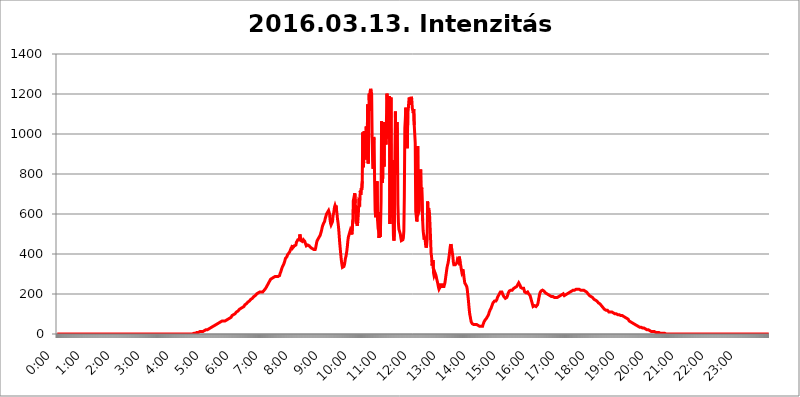
| Category | 2016.03.13. Intenzitás [W/m^2] |
|---|---|
| 0.0 | 0 |
| 0.0006944444444444445 | 0 |
| 0.001388888888888889 | 0 |
| 0.0020833333333333333 | 0 |
| 0.002777777777777778 | 0 |
| 0.003472222222222222 | 0 |
| 0.004166666666666667 | 0 |
| 0.004861111111111111 | 0 |
| 0.005555555555555556 | 0 |
| 0.0062499999999999995 | 0 |
| 0.006944444444444444 | 0 |
| 0.007638888888888889 | 0 |
| 0.008333333333333333 | 0 |
| 0.009027777777777779 | 0 |
| 0.009722222222222222 | 0 |
| 0.010416666666666666 | 0 |
| 0.011111111111111112 | 0 |
| 0.011805555555555555 | 0 |
| 0.012499999999999999 | 0 |
| 0.013194444444444444 | 0 |
| 0.013888888888888888 | 0 |
| 0.014583333333333332 | 0 |
| 0.015277777777777777 | 0 |
| 0.015972222222222224 | 0 |
| 0.016666666666666666 | 0 |
| 0.017361111111111112 | 0 |
| 0.018055555555555557 | 0 |
| 0.01875 | 0 |
| 0.019444444444444445 | 0 |
| 0.02013888888888889 | 0 |
| 0.020833333333333332 | 0 |
| 0.02152777777777778 | 0 |
| 0.022222222222222223 | 0 |
| 0.02291666666666667 | 0 |
| 0.02361111111111111 | 0 |
| 0.024305555555555556 | 0 |
| 0.024999999999999998 | 0 |
| 0.025694444444444447 | 0 |
| 0.02638888888888889 | 0 |
| 0.027083333333333334 | 0 |
| 0.027777777777777776 | 0 |
| 0.02847222222222222 | 0 |
| 0.029166666666666664 | 0 |
| 0.029861111111111113 | 0 |
| 0.030555555555555555 | 0 |
| 0.03125 | 0 |
| 0.03194444444444445 | 0 |
| 0.03263888888888889 | 0 |
| 0.03333333333333333 | 0 |
| 0.034027777777777775 | 0 |
| 0.034722222222222224 | 0 |
| 0.035416666666666666 | 0 |
| 0.036111111111111115 | 0 |
| 0.03680555555555556 | 0 |
| 0.0375 | 0 |
| 0.03819444444444444 | 0 |
| 0.03888888888888889 | 0 |
| 0.03958333333333333 | 0 |
| 0.04027777777777778 | 0 |
| 0.04097222222222222 | 0 |
| 0.041666666666666664 | 0 |
| 0.042361111111111106 | 0 |
| 0.04305555555555556 | 0 |
| 0.043750000000000004 | 0 |
| 0.044444444444444446 | 0 |
| 0.04513888888888889 | 0 |
| 0.04583333333333334 | 0 |
| 0.04652777777777778 | 0 |
| 0.04722222222222222 | 0 |
| 0.04791666666666666 | 0 |
| 0.04861111111111111 | 0 |
| 0.049305555555555554 | 0 |
| 0.049999999999999996 | 0 |
| 0.05069444444444445 | 0 |
| 0.051388888888888894 | 0 |
| 0.052083333333333336 | 0 |
| 0.05277777777777778 | 0 |
| 0.05347222222222222 | 0 |
| 0.05416666666666667 | 0 |
| 0.05486111111111111 | 0 |
| 0.05555555555555555 | 0 |
| 0.05625 | 0 |
| 0.05694444444444444 | 0 |
| 0.057638888888888885 | 0 |
| 0.05833333333333333 | 0 |
| 0.05902777777777778 | 0 |
| 0.059722222222222225 | 0 |
| 0.06041666666666667 | 0 |
| 0.061111111111111116 | 0 |
| 0.06180555555555556 | 0 |
| 0.0625 | 0 |
| 0.06319444444444444 | 0 |
| 0.06388888888888888 | 0 |
| 0.06458333333333334 | 0 |
| 0.06527777777777778 | 0 |
| 0.06597222222222222 | 0 |
| 0.06666666666666667 | 0 |
| 0.06736111111111111 | 0 |
| 0.06805555555555555 | 0 |
| 0.06874999999999999 | 0 |
| 0.06944444444444443 | 0 |
| 0.07013888888888889 | 0 |
| 0.07083333333333333 | 0 |
| 0.07152777777777779 | 0 |
| 0.07222222222222223 | 0 |
| 0.07291666666666667 | 0 |
| 0.07361111111111111 | 0 |
| 0.07430555555555556 | 0 |
| 0.075 | 0 |
| 0.07569444444444444 | 0 |
| 0.0763888888888889 | 0 |
| 0.07708333333333334 | 0 |
| 0.07777777777777778 | 0 |
| 0.07847222222222222 | 0 |
| 0.07916666666666666 | 0 |
| 0.0798611111111111 | 0 |
| 0.08055555555555556 | 0 |
| 0.08125 | 0 |
| 0.08194444444444444 | 0 |
| 0.08263888888888889 | 0 |
| 0.08333333333333333 | 0 |
| 0.08402777777777777 | 0 |
| 0.08472222222222221 | 0 |
| 0.08541666666666665 | 0 |
| 0.08611111111111112 | 0 |
| 0.08680555555555557 | 0 |
| 0.08750000000000001 | 0 |
| 0.08819444444444445 | 0 |
| 0.08888888888888889 | 0 |
| 0.08958333333333333 | 0 |
| 0.09027777777777778 | 0 |
| 0.09097222222222222 | 0 |
| 0.09166666666666667 | 0 |
| 0.09236111111111112 | 0 |
| 0.09305555555555556 | 0 |
| 0.09375 | 0 |
| 0.09444444444444444 | 0 |
| 0.09513888888888888 | 0 |
| 0.09583333333333333 | 0 |
| 0.09652777777777777 | 0 |
| 0.09722222222222222 | 0 |
| 0.09791666666666667 | 0 |
| 0.09861111111111111 | 0 |
| 0.09930555555555555 | 0 |
| 0.09999999999999999 | 0 |
| 0.10069444444444443 | 0 |
| 0.1013888888888889 | 0 |
| 0.10208333333333335 | 0 |
| 0.10277777777777779 | 0 |
| 0.10347222222222223 | 0 |
| 0.10416666666666667 | 0 |
| 0.10486111111111111 | 0 |
| 0.10555555555555556 | 0 |
| 0.10625 | 0 |
| 0.10694444444444444 | 0 |
| 0.1076388888888889 | 0 |
| 0.10833333333333334 | 0 |
| 0.10902777777777778 | 0 |
| 0.10972222222222222 | 0 |
| 0.1111111111111111 | 0 |
| 0.11180555555555556 | 0 |
| 0.11180555555555556 | 0 |
| 0.1125 | 0 |
| 0.11319444444444444 | 0 |
| 0.11388888888888889 | 0 |
| 0.11458333333333333 | 0 |
| 0.11527777777777777 | 0 |
| 0.11597222222222221 | 0 |
| 0.11666666666666665 | 0 |
| 0.1173611111111111 | 0 |
| 0.11805555555555557 | 0 |
| 0.11944444444444445 | 0 |
| 0.12013888888888889 | 0 |
| 0.12083333333333333 | 0 |
| 0.12152777777777778 | 0 |
| 0.12222222222222223 | 0 |
| 0.12291666666666667 | 0 |
| 0.12291666666666667 | 0 |
| 0.12361111111111112 | 0 |
| 0.12430555555555556 | 0 |
| 0.125 | 0 |
| 0.12569444444444444 | 0 |
| 0.12638888888888888 | 0 |
| 0.12708333333333333 | 0 |
| 0.16875 | 0 |
| 0.12847222222222224 | 0 |
| 0.12916666666666668 | 0 |
| 0.12986111111111112 | 0 |
| 0.13055555555555556 | 0 |
| 0.13125 | 0 |
| 0.13194444444444445 | 0 |
| 0.1326388888888889 | 0 |
| 0.13333333333333333 | 0 |
| 0.13402777777777777 | 0 |
| 0.13402777777777777 | 0 |
| 0.13472222222222222 | 0 |
| 0.13541666666666666 | 0 |
| 0.1361111111111111 | 0 |
| 0.13749999999999998 | 0 |
| 0.13819444444444443 | 0 |
| 0.1388888888888889 | 0 |
| 0.13958333333333334 | 0 |
| 0.14027777777777778 | 0 |
| 0.14097222222222222 | 0 |
| 0.14166666666666666 | 0 |
| 0.1423611111111111 | 0 |
| 0.14305555555555557 | 0 |
| 0.14375000000000002 | 0 |
| 0.14444444444444446 | 0 |
| 0.1451388888888889 | 0 |
| 0.1451388888888889 | 0 |
| 0.14652777777777778 | 0 |
| 0.14722222222222223 | 0 |
| 0.14791666666666667 | 0 |
| 0.1486111111111111 | 0 |
| 0.14930555555555555 | 0 |
| 0.15 | 0 |
| 0.15069444444444444 | 0 |
| 0.15138888888888888 | 0 |
| 0.15208333333333332 | 0 |
| 0.15277777777777776 | 0 |
| 0.15347222222222223 | 0 |
| 0.15416666666666667 | 0 |
| 0.15486111111111112 | 0 |
| 0.15555555555555556 | 0 |
| 0.15625 | 0 |
| 0.15694444444444444 | 0 |
| 0.15763888888888888 | 0 |
| 0.15833333333333333 | 0 |
| 0.15902777777777777 | 0 |
| 0.15972222222222224 | 0 |
| 0.16041666666666668 | 0 |
| 0.16111111111111112 | 0 |
| 0.16180555555555556 | 0 |
| 0.1625 | 0 |
| 0.16319444444444445 | 0 |
| 0.1638888888888889 | 0 |
| 0.16458333333333333 | 0 |
| 0.16527777777777777 | 0 |
| 0.16597222222222222 | 0 |
| 0.16666666666666666 | 0 |
| 0.1673611111111111 | 0 |
| 0.16805555555555554 | 0 |
| 0.16874999999999998 | 0 |
| 0.16944444444444443 | 0 |
| 0.17013888888888887 | 0 |
| 0.1708333333333333 | 0 |
| 0.17152777777777775 | 0 |
| 0.17222222222222225 | 0 |
| 0.1729166666666667 | 0 |
| 0.17361111111111113 | 0 |
| 0.17430555555555557 | 0 |
| 0.17500000000000002 | 0 |
| 0.17569444444444446 | 0 |
| 0.1763888888888889 | 0 |
| 0.17708333333333334 | 0 |
| 0.17777777777777778 | 0 |
| 0.17847222222222223 | 0 |
| 0.17916666666666667 | 0 |
| 0.1798611111111111 | 0 |
| 0.18055555555555555 | 0 |
| 0.18125 | 0 |
| 0.18194444444444444 | 0 |
| 0.1826388888888889 | 0 |
| 0.18333333333333335 | 0 |
| 0.1840277777777778 | 0 |
| 0.18472222222222223 | 0 |
| 0.18541666666666667 | 0 |
| 0.18611111111111112 | 0 |
| 0.18680555555555556 | 0 |
| 0.1875 | 0 |
| 0.18819444444444444 | 0 |
| 0.18888888888888888 | 0 |
| 0.18958333333333333 | 0 |
| 0.19027777777777777 | 3.525 |
| 0.1909722222222222 | 3.525 |
| 0.19166666666666665 | 3.525 |
| 0.19236111111111112 | 3.525 |
| 0.19305555555555554 | 3.525 |
| 0.19375 | 3.525 |
| 0.19444444444444445 | 3.525 |
| 0.1951388888888889 | 3.525 |
| 0.19583333333333333 | 7.887 |
| 0.19652777777777777 | 7.887 |
| 0.19722222222222222 | 7.887 |
| 0.19791666666666666 | 7.887 |
| 0.1986111111111111 | 7.887 |
| 0.19930555555555554 | 12.257 |
| 0.19999999999999998 | 12.257 |
| 0.20069444444444443 | 12.257 |
| 0.20138888888888887 | 12.257 |
| 0.2020833333333333 | 12.257 |
| 0.2027777777777778 | 12.257 |
| 0.2034722222222222 | 12.257 |
| 0.2041666666666667 | 12.257 |
| 0.20486111111111113 | 16.636 |
| 0.20555555555555557 | 16.636 |
| 0.20625000000000002 | 16.636 |
| 0.20694444444444446 | 16.636 |
| 0.2076388888888889 | 16.636 |
| 0.20833333333333334 | 21.024 |
| 0.20902777777777778 | 21.024 |
| 0.20972222222222223 | 21.024 |
| 0.21041666666666667 | 21.024 |
| 0.2111111111111111 | 25.419 |
| 0.21180555555555555 | 25.419 |
| 0.2125 | 25.419 |
| 0.21319444444444444 | 29.823 |
| 0.2138888888888889 | 29.823 |
| 0.21458333333333335 | 29.823 |
| 0.2152777777777778 | 34.234 |
| 0.21597222222222223 | 34.234 |
| 0.21666666666666667 | 34.234 |
| 0.21736111111111112 | 38.653 |
| 0.21805555555555556 | 38.653 |
| 0.21875 | 38.653 |
| 0.21944444444444444 | 43.079 |
| 0.22013888888888888 | 43.079 |
| 0.22083333333333333 | 43.079 |
| 0.22152777777777777 | 47.511 |
| 0.2222222222222222 | 47.511 |
| 0.22291666666666665 | 47.511 |
| 0.2236111111111111 | 51.951 |
| 0.22430555555555556 | 51.951 |
| 0.225 | 51.951 |
| 0.22569444444444445 | 56.398 |
| 0.2263888888888889 | 56.398 |
| 0.22708333333333333 | 56.398 |
| 0.22777777777777777 | 60.85 |
| 0.22847222222222222 | 60.85 |
| 0.22916666666666666 | 60.85 |
| 0.2298611111111111 | 60.85 |
| 0.23055555555555554 | 65.31 |
| 0.23124999999999998 | 65.31 |
| 0.23194444444444443 | 65.31 |
| 0.23263888888888887 | 65.31 |
| 0.2333333333333333 | 65.31 |
| 0.2340277777777778 | 65.31 |
| 0.2347222222222222 | 65.31 |
| 0.2354166666666667 | 65.31 |
| 0.23611111111111113 | 65.31 |
| 0.23680555555555557 | 69.775 |
| 0.23750000000000002 | 69.775 |
| 0.23819444444444446 | 69.775 |
| 0.2388888888888889 | 69.775 |
| 0.23958333333333334 | 74.246 |
| 0.24027777777777778 | 74.246 |
| 0.24097222222222223 | 74.246 |
| 0.24166666666666667 | 78.722 |
| 0.2423611111111111 | 83.205 |
| 0.24305555555555555 | 83.205 |
| 0.24375 | 83.205 |
| 0.24444444444444446 | 87.692 |
| 0.24513888888888888 | 92.184 |
| 0.24583333333333335 | 92.184 |
| 0.2465277777777778 | 92.184 |
| 0.24722222222222223 | 96.682 |
| 0.24791666666666667 | 96.682 |
| 0.24861111111111112 | 101.184 |
| 0.24930555555555556 | 101.184 |
| 0.25 | 101.184 |
| 0.25069444444444444 | 105.69 |
| 0.2513888888888889 | 110.201 |
| 0.2520833333333333 | 110.201 |
| 0.25277777777777777 | 110.201 |
| 0.2534722222222222 | 114.716 |
| 0.25416666666666665 | 119.235 |
| 0.2548611111111111 | 119.235 |
| 0.2555555555555556 | 123.758 |
| 0.25625000000000003 | 123.758 |
| 0.2569444444444445 | 123.758 |
| 0.2576388888888889 | 128.284 |
| 0.25833333333333336 | 128.284 |
| 0.2590277777777778 | 128.284 |
| 0.25972222222222224 | 132.814 |
| 0.2604166666666667 | 137.347 |
| 0.2611111111111111 | 137.347 |
| 0.26180555555555557 | 137.347 |
| 0.2625 | 141.884 |
| 0.26319444444444445 | 146.423 |
| 0.2638888888888889 | 146.423 |
| 0.26458333333333334 | 150.964 |
| 0.2652777777777778 | 150.964 |
| 0.2659722222222222 | 155.509 |
| 0.26666666666666666 | 155.509 |
| 0.2673611111111111 | 160.056 |
| 0.26805555555555555 | 160.056 |
| 0.26875 | 164.605 |
| 0.26944444444444443 | 164.605 |
| 0.2701388888888889 | 169.156 |
| 0.2708333333333333 | 169.156 |
| 0.27152777777777776 | 173.709 |
| 0.2722222222222222 | 173.709 |
| 0.27291666666666664 | 178.264 |
| 0.2736111111111111 | 178.264 |
| 0.2743055555555555 | 182.82 |
| 0.27499999999999997 | 182.82 |
| 0.27569444444444446 | 187.378 |
| 0.27638888888888885 | 187.378 |
| 0.27708333333333335 | 191.937 |
| 0.2777777777777778 | 191.937 |
| 0.27847222222222223 | 196.497 |
| 0.2791666666666667 | 196.497 |
| 0.2798611111111111 | 201.058 |
| 0.28055555555555556 | 201.058 |
| 0.28125 | 201.058 |
| 0.28194444444444444 | 205.62 |
| 0.2826388888888889 | 205.62 |
| 0.2833333333333333 | 210.182 |
| 0.28402777777777777 | 210.182 |
| 0.2847222222222222 | 210.182 |
| 0.28541666666666665 | 210.182 |
| 0.28611111111111115 | 210.182 |
| 0.28680555555555554 | 210.182 |
| 0.28750000000000003 | 210.182 |
| 0.2881944444444445 | 210.182 |
| 0.2888888888888889 | 210.182 |
| 0.28958333333333336 | 214.746 |
| 0.2902777777777778 | 219.309 |
| 0.29097222222222224 | 219.309 |
| 0.2916666666666667 | 223.873 |
| 0.2923611111111111 | 228.436 |
| 0.29305555555555557 | 233 |
| 0.29375 | 237.564 |
| 0.29444444444444445 | 242.127 |
| 0.2951388888888889 | 246.689 |
| 0.29583333333333334 | 251.251 |
| 0.2965277777777778 | 255.813 |
| 0.2972222222222222 | 260.373 |
| 0.29791666666666666 | 264.932 |
| 0.2986111111111111 | 269.49 |
| 0.29930555555555555 | 274.047 |
| 0.3 | 274.047 |
| 0.30069444444444443 | 278.603 |
| 0.3013888888888889 | 278.603 |
| 0.3020833333333333 | 278.603 |
| 0.30277777777777776 | 283.156 |
| 0.3034722222222222 | 283.156 |
| 0.30416666666666664 | 287.709 |
| 0.3048611111111111 | 287.709 |
| 0.3055555555555555 | 287.709 |
| 0.30624999999999997 | 287.709 |
| 0.3069444444444444 | 287.709 |
| 0.3076388888888889 | 287.709 |
| 0.30833333333333335 | 287.709 |
| 0.3090277777777778 | 287.709 |
| 0.30972222222222223 | 287.709 |
| 0.3104166666666667 | 287.709 |
| 0.3111111111111111 | 292.259 |
| 0.31180555555555556 | 292.259 |
| 0.3125 | 301.354 |
| 0.31319444444444444 | 305.898 |
| 0.3138888888888889 | 314.98 |
| 0.3145833333333333 | 324.052 |
| 0.31527777777777777 | 328.584 |
| 0.3159722222222222 | 337.639 |
| 0.31666666666666665 | 342.162 |
| 0.31736111111111115 | 346.682 |
| 0.31805555555555554 | 351.198 |
| 0.31875000000000003 | 360.221 |
| 0.3194444444444445 | 369.23 |
| 0.3201388888888889 | 378.224 |
| 0.32083333333333336 | 378.224 |
| 0.3215277777777778 | 382.715 |
| 0.32222222222222224 | 387.202 |
| 0.3229166666666667 | 396.164 |
| 0.3236111111111111 | 400.638 |
| 0.32430555555555557 | 400.638 |
| 0.325 | 405.108 |
| 0.32569444444444445 | 409.574 |
| 0.3263888888888889 | 414.035 |
| 0.32708333333333334 | 414.035 |
| 0.3277777777777778 | 427.39 |
| 0.3284722222222222 | 422.943 |
| 0.32916666666666666 | 436.27 |
| 0.3298611111111111 | 445.129 |
| 0.33055555555555555 | 431.833 |
| 0.33125 | 431.833 |
| 0.33194444444444443 | 431.833 |
| 0.3326388888888889 | 440.702 |
| 0.3333333333333333 | 445.129 |
| 0.3340277777777778 | 440.702 |
| 0.3347222222222222 | 445.129 |
| 0.3354166666666667 | 458.38 |
| 0.3361111111111111 | 458.38 |
| 0.3368055555555556 | 462.786 |
| 0.33749999999999997 | 471.582 |
| 0.33819444444444446 | 467.187 |
| 0.33888888888888885 | 471.582 |
| 0.33958333333333335 | 471.582 |
| 0.34027777777777773 | 497.836 |
| 0.34097222222222223 | 484.735 |
| 0.3416666666666666 | 467.187 |
| 0.3423611111111111 | 462.786 |
| 0.3430555555555555 | 462.786 |
| 0.34375 | 462.786 |
| 0.3444444444444445 | 462.786 |
| 0.3451388888888889 | 471.582 |
| 0.3458333333333334 | 467.187 |
| 0.34652777777777777 | 467.187 |
| 0.34722222222222227 | 462.786 |
| 0.34791666666666665 | 453.968 |
| 0.34861111111111115 | 449.551 |
| 0.34930555555555554 | 440.702 |
| 0.35000000000000003 | 440.702 |
| 0.3506944444444444 | 445.129 |
| 0.3513888888888889 | 445.129 |
| 0.3520833333333333 | 449.551 |
| 0.3527777777777778 | 440.702 |
| 0.3534722222222222 | 440.702 |
| 0.3541666666666667 | 436.27 |
| 0.3548611111111111 | 436.27 |
| 0.35555555555555557 | 431.833 |
| 0.35625 | 431.833 |
| 0.35694444444444445 | 427.39 |
| 0.3576388888888889 | 427.39 |
| 0.35833333333333334 | 422.943 |
| 0.3590277777777778 | 422.943 |
| 0.3597222222222222 | 422.943 |
| 0.36041666666666666 | 418.492 |
| 0.3611111111111111 | 418.492 |
| 0.36180555555555555 | 422.943 |
| 0.3625 | 431.833 |
| 0.36319444444444443 | 445.129 |
| 0.3638888888888889 | 458.38 |
| 0.3645833333333333 | 467.187 |
| 0.3652777777777778 | 471.582 |
| 0.3659722222222222 | 475.972 |
| 0.3666666666666667 | 480.356 |
| 0.3673611111111111 | 484.735 |
| 0.3680555555555556 | 489.108 |
| 0.36874999999999997 | 493.475 |
| 0.36944444444444446 | 502.192 |
| 0.37013888888888885 | 506.542 |
| 0.37083333333333335 | 519.555 |
| 0.37152777777777773 | 532.513 |
| 0.37222222222222223 | 541.121 |
| 0.3729166666666666 | 545.416 |
| 0.3736111111111111 | 553.986 |
| 0.3743055555555555 | 558.261 |
| 0.375 | 562.53 |
| 0.3756944444444445 | 575.299 |
| 0.3763888888888889 | 575.299 |
| 0.3770833333333334 | 592.233 |
| 0.37777777777777777 | 600.661 |
| 0.37847222222222227 | 604.864 |
| 0.37916666666666665 | 609.062 |
| 0.37986111111111115 | 613.252 |
| 0.38055555555555554 | 617.436 |
| 0.38125000000000003 | 621.613 |
| 0.3819444444444444 | 600.661 |
| 0.3826388888888889 | 571.049 |
| 0.3833333333333333 | 553.986 |
| 0.3840277777777778 | 545.416 |
| 0.3847222222222222 | 541.121 |
| 0.3854166666666667 | 549.704 |
| 0.3861111111111111 | 562.53 |
| 0.38680555555555557 | 592.233 |
| 0.3875 | 600.661 |
| 0.38819444444444445 | 617.436 |
| 0.3888888888888889 | 634.105 |
| 0.38958333333333334 | 642.4 |
| 0.3902777777777778 | 634.105 |
| 0.3909722222222222 | 642.4 |
| 0.39166666666666666 | 621.613 |
| 0.3923611111111111 | 600.661 |
| 0.39305555555555555 | 575.299 |
| 0.39375 | 558.261 |
| 0.39444444444444443 | 536.82 |
| 0.3951388888888889 | 506.542 |
| 0.3958333333333333 | 471.582 |
| 0.3965277777777778 | 440.702 |
| 0.3972222222222222 | 414.035 |
| 0.3979166666666667 | 387.202 |
| 0.3986111111111111 | 364.728 |
| 0.3993055555555556 | 346.682 |
| 0.39999999999999997 | 333.113 |
| 0.40069444444444446 | 328.584 |
| 0.40138888888888885 | 333.113 |
| 0.40208333333333335 | 337.639 |
| 0.40277777777777773 | 346.682 |
| 0.40347222222222223 | 360.221 |
| 0.4041666666666666 | 378.224 |
| 0.4048611111111111 | 387.202 |
| 0.4055555555555555 | 400.638 |
| 0.40625 | 418.492 |
| 0.4069444444444445 | 440.702 |
| 0.4076388888888889 | 467.187 |
| 0.4083333333333334 | 484.735 |
| 0.40902777777777777 | 493.475 |
| 0.40972222222222227 | 497.836 |
| 0.41041666666666665 | 510.885 |
| 0.41111111111111115 | 519.555 |
| 0.41180555555555554 | 519.555 |
| 0.41250000000000003 | 506.542 |
| 0.4131944444444444 | 497.836 |
| 0.4138888888888889 | 502.192 |
| 0.4145833333333333 | 566.793 |
| 0.4152777777777778 | 667.123 |
| 0.4159722222222222 | 671.22 |
| 0.4166666666666667 | 667.123 |
| 0.4173611111111111 | 703.762 |
| 0.41805555555555557 | 654.791 |
| 0.41875 | 566.793 |
| 0.41944444444444445 | 562.53 |
| 0.4201388888888889 | 549.704 |
| 0.42083333333333334 | 541.121 |
| 0.4215277777777778 | 562.53 |
| 0.4222222222222222 | 596.45 |
| 0.42291666666666666 | 663.019 |
| 0.4236111111111111 | 658.909 |
| 0.42430555555555555 | 654.791 |
| 0.425 | 715.858 |
| 0.42569444444444443 | 695.666 |
| 0.4263888888888889 | 727.896 |
| 0.4270833333333333 | 719.877 |
| 0.4277777777777778 | 763.674 |
| 0.4284722222222222 | 1007.383 |
| 0.4291666666666667 | 833.834 |
| 0.4298611111111111 | 860.676 |
| 0.4305555555555556 | 1014.852 |
| 0.43124999999999997 | 891.099 |
| 0.43194444444444446 | 872.114 |
| 0.43263888888888885 | 906.223 |
| 0.43333333333333335 | 1037.277 |
| 0.43402777777777773 | 973.772 |
| 0.43472222222222223 | 955.071 |
| 0.4354166666666666 | 1147.086 |
| 0.4361111111111111 | 853.029 |
| 0.4368055555555555 | 999.916 |
| 0.4375 | 1201.843 |
| 0.4381944444444445 | 1116.426 |
| 0.4388888888888889 | 1213.804 |
| 0.4395833333333334 | 1225.859 |
| 0.44027777777777777 | 1213.804 |
| 0.44097222222222227 | 1201.843 |
| 0.44166666666666665 | 973.772 |
| 0.44236111111111115 | 868.305 |
| 0.44305555555555554 | 826.123 |
| 0.44375000000000003 | 984.98 |
| 0.4444444444444444 | 970.034 |
| 0.4451388888888889 | 759.723 |
| 0.4458333333333333 | 617.436 |
| 0.4465277777777778 | 583.779 |
| 0.4472222222222222 | 583.779 |
| 0.4479166666666667 | 743.859 |
| 0.4486111111111111 | 763.674 |
| 0.44930555555555557 | 566.793 |
| 0.45 | 528.2 |
| 0.45069444444444445 | 515.223 |
| 0.4513888888888889 | 480.356 |
| 0.45208333333333334 | 609.062 |
| 0.4527777777777778 | 484.735 |
| 0.4534722222222222 | 545.416 |
| 0.45416666666666666 | 663.019 |
| 0.4548611111111111 | 1063.51 |
| 0.45555555555555555 | 883.516 |
| 0.45625 | 755.766 |
| 0.45694444444444443 | 891.099 |
| 0.4576388888888889 | 943.832 |
| 0.4583333333333333 | 837.682 |
| 0.4590277777777778 | 1059.756 |
| 0.4597222222222222 | 1033.537 |
| 0.4604166666666667 | 1011.118 |
| 0.4611111111111111 | 947.58 |
| 0.4618055555555556 | 1086.097 |
| 0.46249999999999997 | 1201.843 |
| 0.46319444444444446 | 1078.555 |
| 0.46388888888888885 | 977.508 |
| 0.46458333333333335 | 1143.232 |
| 0.46527777777777773 | 1105.019 |
| 0.46597222222222223 | 1189.969 |
| 0.4666666666666666 | 549.704 |
| 0.4673611111111111 | 860.676 |
| 0.4680555555555555 | 1182.099 |
| 0.46875 | 583.779 |
| 0.4694444444444445 | 763.674 |
| 0.4701388888888889 | 868.305 |
| 0.4708333333333334 | 613.252 |
| 0.47152777777777777 | 489.108 |
| 0.47222222222222227 | 467.187 |
| 0.47291666666666665 | 519.555 |
| 0.47361111111111115 | 902.447 |
| 0.47430555555555554 | 1112.618 |
| 0.47500000000000003 | 795.074 |
| 0.4756944444444444 | 795.074 |
| 0.4763888888888889 | 1059.756 |
| 0.4770833333333333 | 992.448 |
| 0.4777777777777778 | 646.537 |
| 0.4784722222222222 | 558.261 |
| 0.4791666666666667 | 523.88 |
| 0.4798611111111111 | 515.223 |
| 0.48055555555555557 | 510.885 |
| 0.48125 | 497.836 |
| 0.48194444444444445 | 480.356 |
| 0.4826388888888889 | 467.187 |
| 0.48333333333333334 | 462.786 |
| 0.4840277777777778 | 471.582 |
| 0.4847222222222222 | 471.582 |
| 0.48541666666666666 | 480.356 |
| 0.4861111111111111 | 515.223 |
| 0.48680555555555555 | 687.544 |
| 0.4875 | 1029.798 |
| 0.48819444444444443 | 1074.789 |
| 0.4888888888888889 | 1131.708 |
| 0.4895833333333333 | 1037.277 |
| 0.4902777777777778 | 973.772 |
| 0.4909722222222222 | 928.819 |
| 0.4916666666666667 | 1108.816 |
| 0.4923611111111111 | 1124.056 |
| 0.4930555555555556 | 1162.571 |
| 0.49374999999999997 | 1182.099 |
| 0.49444444444444446 | 1147.086 |
| 0.49513888888888885 | 1154.814 |
| 0.49583333333333335 | 1178.177 |
| 0.49652777777777773 | 1186.03 |
| 0.49722222222222223 | 1174.263 |
| 0.4979166666666666 | 1131.708 |
| 0.4986111111111111 | 1127.879 |
| 0.4993055555555555 | 1105.019 |
| 0.5 | 1124.056 |
| 0.5006944444444444 | 1044.762 |
| 0.5013888888888889 | 1041.019 |
| 0.5020833333333333 | 955.071 |
| 0.5027777777777778 | 613.252 |
| 0.5034722222222222 | 592.233 |
| 0.5041666666666667 | 562.53 |
| 0.5048611111111111 | 571.049 |
| 0.5055555555555555 | 940.082 |
| 0.50625 | 617.436 |
| 0.5069444444444444 | 609.062 |
| 0.5076388888888889 | 617.436 |
| 0.5083333333333333 | 731.896 |
| 0.5090277777777777 | 767.62 |
| 0.5097222222222222 | 822.26 |
| 0.5104166666666666 | 667.123 |
| 0.5111111111111112 | 731.896 |
| 0.5118055555555555 | 727.896 |
| 0.5125000000000001 | 566.793 |
| 0.5131944444444444 | 515.223 |
| 0.513888888888889 | 493.475 |
| 0.5145833333333333 | 471.582 |
| 0.5152777777777778 | 480.356 |
| 0.5159722222222222 | 471.582 |
| 0.5166666666666667 | 445.129 |
| 0.517361111111111 | 431.833 |
| 0.5180555555555556 | 440.702 |
| 0.5187499999999999 | 471.582 |
| 0.5194444444444445 | 663.019 |
| 0.5201388888888888 | 562.53 |
| 0.5208333333333334 | 629.948 |
| 0.5215277777777778 | 625.784 |
| 0.5222222222222223 | 592.233 |
| 0.5229166666666667 | 536.82 |
| 0.5236111111111111 | 475.972 |
| 0.5243055555555556 | 405.108 |
| 0.525 | 387.202 |
| 0.5256944444444445 | 342.162 |
| 0.5263888888888889 | 342.162 |
| 0.5270833333333333 | 369.23 |
| 0.5277777777777778 | 305.898 |
| 0.5284722222222222 | 292.259 |
| 0.5291666666666667 | 296.808 |
| 0.5298611111111111 | 305.898 |
| 0.5305555555555556 | 305.898 |
| 0.53125 | 292.259 |
| 0.5319444444444444 | 278.603 |
| 0.5326388888888889 | 269.49 |
| 0.5333333333333333 | 269.49 |
| 0.5340277777777778 | 246.689 |
| 0.5347222222222222 | 233 |
| 0.5354166666666667 | 223.873 |
| 0.5361111111111111 | 223.873 |
| 0.5368055555555555 | 233 |
| 0.5375 | 246.689 |
| 0.5381944444444444 | 251.251 |
| 0.5388888888888889 | 251.251 |
| 0.5395833333333333 | 246.689 |
| 0.5402777777777777 | 237.564 |
| 0.5409722222222222 | 233 |
| 0.5416666666666666 | 233 |
| 0.5423611111111112 | 237.564 |
| 0.5430555555555555 | 246.689 |
| 0.5437500000000001 | 255.813 |
| 0.5444444444444444 | 274.047 |
| 0.545138888888889 | 292.259 |
| 0.5458333333333333 | 310.44 |
| 0.5465277777777778 | 328.584 |
| 0.5472222222222222 | 342.162 |
| 0.5479166666666667 | 351.198 |
| 0.548611111111111 | 364.728 |
| 0.5493055555555556 | 382.715 |
| 0.5499999999999999 | 400.638 |
| 0.5506944444444445 | 422.943 |
| 0.5513888888888888 | 440.702 |
| 0.5520833333333334 | 449.551 |
| 0.5527777777777778 | 436.27 |
| 0.5534722222222223 | 422.943 |
| 0.5541666666666667 | 405.108 |
| 0.5548611111111111 | 387.202 |
| 0.5555555555555556 | 360.221 |
| 0.55625 | 346.682 |
| 0.5569444444444445 | 342.162 |
| 0.5576388888888889 | 342.162 |
| 0.5583333333333333 | 346.682 |
| 0.5590277777777778 | 351.198 |
| 0.5597222222222222 | 351.198 |
| 0.5604166666666667 | 355.712 |
| 0.5611111111111111 | 369.23 |
| 0.5618055555555556 | 364.728 |
| 0.5625 | 360.221 |
| 0.5631944444444444 | 360.221 |
| 0.5638888888888889 | 387.202 |
| 0.5645833333333333 | 382.715 |
| 0.5652777777777778 | 351.198 |
| 0.5659722222222222 | 342.162 |
| 0.5666666666666667 | 324.052 |
| 0.5673611111111111 | 310.44 |
| 0.5680555555555555 | 310.44 |
| 0.56875 | 324.052 |
| 0.5694444444444444 | 324.052 |
| 0.5701388888888889 | 292.259 |
| 0.5708333333333333 | 274.047 |
| 0.5715277777777777 | 255.813 |
| 0.5722222222222222 | 251.251 |
| 0.5729166666666666 | 246.689 |
| 0.5736111111111112 | 246.689 |
| 0.5743055555555555 | 237.564 |
| 0.5750000000000001 | 223.873 |
| 0.5756944444444444 | 201.058 |
| 0.576388888888889 | 178.264 |
| 0.5770833333333333 | 150.964 |
| 0.5777777777777778 | 123.758 |
| 0.5784722222222222 | 101.184 |
| 0.5791666666666667 | 87.692 |
| 0.579861111111111 | 74.246 |
| 0.5805555555555556 | 60.85 |
| 0.5812499999999999 | 56.398 |
| 0.5819444444444445 | 51.951 |
| 0.5826388888888888 | 47.511 |
| 0.5833333333333334 | 47.511 |
| 0.5840277777777778 | 47.511 |
| 0.5847222222222223 | 47.511 |
| 0.5854166666666667 | 47.511 |
| 0.5861111111111111 | 47.511 |
| 0.5868055555555556 | 47.511 |
| 0.5875 | 47.511 |
| 0.5881944444444445 | 47.511 |
| 0.5888888888888889 | 47.511 |
| 0.5895833333333333 | 47.511 |
| 0.5902777777777778 | 43.079 |
| 0.5909722222222222 | 43.079 |
| 0.5916666666666667 | 38.653 |
| 0.5923611111111111 | 38.653 |
| 0.5930555555555556 | 38.653 |
| 0.59375 | 38.653 |
| 0.5944444444444444 | 38.653 |
| 0.5951388888888889 | 34.234 |
| 0.5958333333333333 | 34.234 |
| 0.5965277777777778 | 38.653 |
| 0.5972222222222222 | 47.511 |
| 0.5979166666666667 | 51.951 |
| 0.5986111111111111 | 60.85 |
| 0.5993055555555555 | 65.31 |
| 0.6 | 69.775 |
| 0.6006944444444444 | 69.775 |
| 0.6013888888888889 | 74.246 |
| 0.6020833333333333 | 78.722 |
| 0.6027777777777777 | 83.205 |
| 0.6034722222222222 | 87.692 |
| 0.6041666666666666 | 92.184 |
| 0.6048611111111112 | 96.682 |
| 0.6055555555555555 | 105.69 |
| 0.6062500000000001 | 110.201 |
| 0.6069444444444444 | 119.235 |
| 0.607638888888889 | 123.758 |
| 0.6083333333333333 | 128.284 |
| 0.6090277777777778 | 132.814 |
| 0.6097222222222222 | 141.884 |
| 0.6104166666666667 | 146.423 |
| 0.611111111111111 | 155.509 |
| 0.6118055555555556 | 155.509 |
| 0.6124999999999999 | 160.056 |
| 0.6131944444444445 | 164.605 |
| 0.6138888888888888 | 164.605 |
| 0.6145833333333334 | 164.605 |
| 0.6152777777777778 | 164.605 |
| 0.6159722222222223 | 169.156 |
| 0.6166666666666667 | 173.709 |
| 0.6173611111111111 | 182.82 |
| 0.6180555555555556 | 187.378 |
| 0.61875 | 191.937 |
| 0.6194444444444445 | 196.497 |
| 0.6201388888888889 | 201.058 |
| 0.6208333333333333 | 205.62 |
| 0.6215277777777778 | 210.182 |
| 0.6222222222222222 | 210.182 |
| 0.6229166666666667 | 210.182 |
| 0.6236111111111111 | 210.182 |
| 0.6243055555555556 | 205.62 |
| 0.625 | 196.497 |
| 0.6256944444444444 | 191.937 |
| 0.6263888888888889 | 187.378 |
| 0.6270833333333333 | 182.82 |
| 0.6277777777777778 | 182.82 |
| 0.6284722222222222 | 178.264 |
| 0.6291666666666667 | 182.82 |
| 0.6298611111111111 | 178.264 |
| 0.6305555555555555 | 182.82 |
| 0.63125 | 187.378 |
| 0.6319444444444444 | 196.497 |
| 0.6326388888888889 | 205.62 |
| 0.6333333333333333 | 210.182 |
| 0.6340277777777777 | 214.746 |
| 0.6347222222222222 | 219.309 |
| 0.6354166666666666 | 219.309 |
| 0.6361111111111112 | 219.309 |
| 0.6368055555555555 | 219.309 |
| 0.6375000000000001 | 219.309 |
| 0.6381944444444444 | 219.309 |
| 0.638888888888889 | 223.873 |
| 0.6395833333333333 | 223.873 |
| 0.6402777777777778 | 228.436 |
| 0.6409722222222222 | 228.436 |
| 0.6416666666666667 | 228.436 |
| 0.642361111111111 | 233 |
| 0.6430555555555556 | 233 |
| 0.6437499999999999 | 237.564 |
| 0.6444444444444445 | 237.564 |
| 0.6451388888888888 | 242.127 |
| 0.6458333333333334 | 246.689 |
| 0.6465277777777778 | 251.251 |
| 0.6472222222222223 | 255.813 |
| 0.6479166666666667 | 260.373 |
| 0.6486111111111111 | 251.251 |
| 0.6493055555555556 | 242.127 |
| 0.65 | 233 |
| 0.6506944444444445 | 228.436 |
| 0.6513888888888889 | 228.436 |
| 0.6520833333333333 | 228.436 |
| 0.6527777777777778 | 233 |
| 0.6534722222222222 | 233 |
| 0.6541666666666667 | 228.436 |
| 0.6548611111111111 | 219.309 |
| 0.6555555555555556 | 210.182 |
| 0.65625 | 210.182 |
| 0.6569444444444444 | 210.182 |
| 0.6576388888888889 | 205.62 |
| 0.6583333333333333 | 205.62 |
| 0.6590277777777778 | 210.182 |
| 0.6597222222222222 | 210.182 |
| 0.6604166666666667 | 205.62 |
| 0.6611111111111111 | 201.058 |
| 0.6618055555555555 | 196.497 |
| 0.6625 | 196.497 |
| 0.6631944444444444 | 191.937 |
| 0.6638888888888889 | 182.82 |
| 0.6645833333333333 | 173.709 |
| 0.6652777777777777 | 164.605 |
| 0.6659722222222222 | 155.509 |
| 0.6666666666666666 | 146.423 |
| 0.6673611111111111 | 137.347 |
| 0.6680555555555556 | 137.347 |
| 0.6687500000000001 | 137.347 |
| 0.6694444444444444 | 141.884 |
| 0.6701388888888888 | 137.347 |
| 0.6708333333333334 | 137.347 |
| 0.6715277777777778 | 137.347 |
| 0.6722222222222222 | 137.347 |
| 0.6729166666666666 | 137.347 |
| 0.6736111111111112 | 146.423 |
| 0.6743055555555556 | 155.509 |
| 0.6749999999999999 | 169.156 |
| 0.6756944444444444 | 182.82 |
| 0.6763888888888889 | 196.497 |
| 0.6770833333333334 | 205.62 |
| 0.6777777777777777 | 210.182 |
| 0.6784722222222223 | 214.746 |
| 0.6791666666666667 | 219.309 |
| 0.6798611111111111 | 219.309 |
| 0.6805555555555555 | 219.309 |
| 0.68125 | 219.309 |
| 0.6819444444444445 | 214.746 |
| 0.6826388888888889 | 214.746 |
| 0.6833333333333332 | 210.182 |
| 0.6840277777777778 | 210.182 |
| 0.6847222222222222 | 205.62 |
| 0.6854166666666667 | 201.058 |
| 0.686111111111111 | 201.058 |
| 0.6868055555555556 | 201.058 |
| 0.6875 | 196.497 |
| 0.6881944444444444 | 196.497 |
| 0.688888888888889 | 196.497 |
| 0.6895833333333333 | 191.937 |
| 0.6902777777777778 | 191.937 |
| 0.6909722222222222 | 191.937 |
| 0.6916666666666668 | 191.937 |
| 0.6923611111111111 | 191.937 |
| 0.6930555555555555 | 187.378 |
| 0.69375 | 187.378 |
| 0.6944444444444445 | 187.378 |
| 0.6951388888888889 | 187.378 |
| 0.6958333333333333 | 182.82 |
| 0.6965277777777777 | 182.82 |
| 0.6972222222222223 | 182.82 |
| 0.6979166666666666 | 182.82 |
| 0.6986111111111111 | 182.82 |
| 0.6993055555555556 | 182.82 |
| 0.7000000000000001 | 182.82 |
| 0.7006944444444444 | 182.82 |
| 0.7013888888888888 | 182.82 |
| 0.7020833333333334 | 187.378 |
| 0.7027777777777778 | 187.378 |
| 0.7034722222222222 | 187.378 |
| 0.7041666666666666 | 191.937 |
| 0.7048611111111112 | 191.937 |
| 0.7055555555555556 | 191.937 |
| 0.7062499999999999 | 191.937 |
| 0.7069444444444444 | 196.497 |
| 0.7076388888888889 | 196.497 |
| 0.7083333333333334 | 201.058 |
| 0.7090277777777777 | 201.058 |
| 0.7097222222222223 | 201.058 |
| 0.7104166666666667 | 205.62 |
| 0.7111111111111111 | 191.937 |
| 0.7118055555555555 | 191.937 |
| 0.7125 | 196.497 |
| 0.7131944444444445 | 196.497 |
| 0.7138888888888889 | 201.058 |
| 0.7145833333333332 | 201.058 |
| 0.7152777777777778 | 201.058 |
| 0.7159722222222222 | 205.62 |
| 0.7166666666666667 | 205.62 |
| 0.717361111111111 | 205.62 |
| 0.7180555555555556 | 210.182 |
| 0.71875 | 210.182 |
| 0.7194444444444444 | 210.182 |
| 0.720138888888889 | 210.182 |
| 0.7208333333333333 | 214.746 |
| 0.7215277777777778 | 214.746 |
| 0.7222222222222222 | 214.746 |
| 0.7229166666666668 | 219.309 |
| 0.7236111111111111 | 219.309 |
| 0.7243055555555555 | 219.309 |
| 0.725 | 219.309 |
| 0.7256944444444445 | 219.309 |
| 0.7263888888888889 | 219.309 |
| 0.7270833333333333 | 223.873 |
| 0.7277777777777777 | 223.873 |
| 0.7284722222222223 | 223.873 |
| 0.7291666666666666 | 223.873 |
| 0.7298611111111111 | 223.873 |
| 0.7305555555555556 | 223.873 |
| 0.7312500000000001 | 223.873 |
| 0.7319444444444444 | 223.873 |
| 0.7326388888888888 | 219.309 |
| 0.7333333333333334 | 223.873 |
| 0.7340277777777778 | 219.309 |
| 0.7347222222222222 | 219.309 |
| 0.7354166666666666 | 219.309 |
| 0.7361111111111112 | 219.309 |
| 0.7368055555555556 | 219.309 |
| 0.7374999999999999 | 219.309 |
| 0.7381944444444444 | 219.309 |
| 0.7388888888888889 | 219.309 |
| 0.7395833333333334 | 219.309 |
| 0.7402777777777777 | 214.746 |
| 0.7409722222222223 | 210.182 |
| 0.7416666666666667 | 210.182 |
| 0.7423611111111111 | 210.182 |
| 0.7430555555555555 | 205.62 |
| 0.74375 | 205.62 |
| 0.7444444444444445 | 201.058 |
| 0.7451388888888889 | 201.058 |
| 0.7458333333333332 | 196.497 |
| 0.7465277777777778 | 191.937 |
| 0.7472222222222222 | 191.937 |
| 0.7479166666666667 | 191.937 |
| 0.748611111111111 | 187.378 |
| 0.7493055555555556 | 187.378 |
| 0.75 | 182.82 |
| 0.7506944444444444 | 182.82 |
| 0.751388888888889 | 178.264 |
| 0.7520833333333333 | 178.264 |
| 0.7527777777777778 | 173.709 |
| 0.7534722222222222 | 173.709 |
| 0.7541666666666668 | 169.156 |
| 0.7548611111111111 | 169.156 |
| 0.7555555555555555 | 164.605 |
| 0.75625 | 164.605 |
| 0.7569444444444445 | 164.605 |
| 0.7576388888888889 | 160.056 |
| 0.7583333333333333 | 160.056 |
| 0.7590277777777777 | 155.509 |
| 0.7597222222222223 | 155.509 |
| 0.7604166666666666 | 155.509 |
| 0.7611111111111111 | 150.964 |
| 0.7618055555555556 | 146.423 |
| 0.7625000000000001 | 146.423 |
| 0.7631944444444444 | 141.884 |
| 0.7638888888888888 | 137.347 |
| 0.7645833333333334 | 137.347 |
| 0.7652777777777778 | 132.814 |
| 0.7659722222222222 | 128.284 |
| 0.7666666666666666 | 128.284 |
| 0.7673611111111112 | 123.758 |
| 0.7680555555555556 | 123.758 |
| 0.7687499999999999 | 123.758 |
| 0.7694444444444444 | 119.235 |
| 0.7701388888888889 | 119.235 |
| 0.7708333333333334 | 119.235 |
| 0.7715277777777777 | 119.235 |
| 0.7722222222222223 | 114.716 |
| 0.7729166666666667 | 114.716 |
| 0.7736111111111111 | 110.201 |
| 0.7743055555555555 | 110.201 |
| 0.775 | 110.201 |
| 0.7756944444444445 | 110.201 |
| 0.7763888888888889 | 105.69 |
| 0.7770833333333332 | 105.69 |
| 0.7777777777777778 | 110.201 |
| 0.7784722222222222 | 105.69 |
| 0.7791666666666667 | 105.69 |
| 0.779861111111111 | 105.69 |
| 0.7805555555555556 | 105.69 |
| 0.78125 | 101.184 |
| 0.7819444444444444 | 101.184 |
| 0.782638888888889 | 101.184 |
| 0.7833333333333333 | 101.184 |
| 0.7840277777777778 | 101.184 |
| 0.7847222222222222 | 101.184 |
| 0.7854166666666668 | 101.184 |
| 0.7861111111111111 | 96.682 |
| 0.7868055555555555 | 96.682 |
| 0.7875 | 96.682 |
| 0.7881944444444445 | 96.682 |
| 0.7888888888888889 | 96.682 |
| 0.7895833333333333 | 96.682 |
| 0.7902777777777777 | 92.184 |
| 0.7909722222222223 | 92.184 |
| 0.7916666666666666 | 92.184 |
| 0.7923611111111111 | 92.184 |
| 0.7930555555555556 | 92.184 |
| 0.7937500000000001 | 87.692 |
| 0.7944444444444444 | 87.692 |
| 0.7951388888888888 | 87.692 |
| 0.7958333333333334 | 83.205 |
| 0.7965277777777778 | 83.205 |
| 0.7972222222222222 | 83.205 |
| 0.7979166666666666 | 78.722 |
| 0.7986111111111112 | 78.722 |
| 0.7993055555555556 | 74.246 |
| 0.7999999999999999 | 74.246 |
| 0.8006944444444444 | 74.246 |
| 0.8013888888888889 | 69.775 |
| 0.8020833333333334 | 65.31 |
| 0.8027777777777777 | 65.31 |
| 0.8034722222222223 | 65.31 |
| 0.8041666666666667 | 60.85 |
| 0.8048611111111111 | 60.85 |
| 0.8055555555555555 | 56.398 |
| 0.80625 | 56.398 |
| 0.8069444444444445 | 56.398 |
| 0.8076388888888889 | 51.951 |
| 0.8083333333333332 | 51.951 |
| 0.8090277777777778 | 47.511 |
| 0.8097222222222222 | 47.511 |
| 0.8104166666666667 | 47.511 |
| 0.811111111111111 | 47.511 |
| 0.8118055555555556 | 43.079 |
| 0.8125 | 43.079 |
| 0.8131944444444444 | 38.653 |
| 0.813888888888889 | 38.653 |
| 0.8145833333333333 | 38.653 |
| 0.8152777777777778 | 38.653 |
| 0.8159722222222222 | 38.653 |
| 0.8166666666666668 | 34.234 |
| 0.8173611111111111 | 34.234 |
| 0.8180555555555555 | 34.234 |
| 0.81875 | 34.234 |
| 0.8194444444444445 | 34.234 |
| 0.8201388888888889 | 29.823 |
| 0.8208333333333333 | 29.823 |
| 0.8215277777777777 | 29.823 |
| 0.8222222222222223 | 29.823 |
| 0.8229166666666666 | 29.823 |
| 0.8236111111111111 | 29.823 |
| 0.8243055555555556 | 25.419 |
| 0.8250000000000001 | 25.419 |
| 0.8256944444444444 | 25.419 |
| 0.8263888888888888 | 25.419 |
| 0.8270833333333334 | 21.024 |
| 0.8277777777777778 | 21.024 |
| 0.8284722222222222 | 21.024 |
| 0.8291666666666666 | 21.024 |
| 0.8298611111111112 | 21.024 |
| 0.8305555555555556 | 16.636 |
| 0.8312499999999999 | 16.636 |
| 0.8319444444444444 | 16.636 |
| 0.8326388888888889 | 16.636 |
| 0.8333333333333334 | 12.257 |
| 0.8340277777777777 | 12.257 |
| 0.8347222222222223 | 12.257 |
| 0.8354166666666667 | 12.257 |
| 0.8361111111111111 | 12.257 |
| 0.8368055555555555 | 12.257 |
| 0.8375 | 12.257 |
| 0.8381944444444445 | 12.257 |
| 0.8388888888888889 | 12.257 |
| 0.8395833333333332 | 7.887 |
| 0.8402777777777778 | 7.887 |
| 0.8409722222222222 | 7.887 |
| 0.8416666666666667 | 7.887 |
| 0.842361111111111 | 7.887 |
| 0.8430555555555556 | 7.887 |
| 0.84375 | 7.887 |
| 0.8444444444444444 | 3.525 |
| 0.845138888888889 | 3.525 |
| 0.8458333333333333 | 3.525 |
| 0.8465277777777778 | 3.525 |
| 0.8472222222222222 | 3.525 |
| 0.8479166666666668 | 3.525 |
| 0.8486111111111111 | 3.525 |
| 0.8493055555555555 | 3.525 |
| 0.85 | 3.525 |
| 0.8506944444444445 | 3.525 |
| 0.8513888888888889 | 3.525 |
| 0.8520833333333333 | 3.525 |
| 0.8527777777777777 | 3.525 |
| 0.8534722222222223 | 0 |
| 0.8541666666666666 | 0 |
| 0.8548611111111111 | 0 |
| 0.8555555555555556 | 0 |
| 0.8562500000000001 | 0 |
| 0.8569444444444444 | 0 |
| 0.8576388888888888 | 0 |
| 0.8583333333333334 | 0 |
| 0.8590277777777778 | 0 |
| 0.8597222222222222 | 0 |
| 0.8604166666666666 | 0 |
| 0.8611111111111112 | 0 |
| 0.8618055555555556 | 0 |
| 0.8624999999999999 | 0 |
| 0.8631944444444444 | 0 |
| 0.8638888888888889 | 0 |
| 0.8645833333333334 | 0 |
| 0.8652777777777777 | 0 |
| 0.8659722222222223 | 0 |
| 0.8666666666666667 | 0 |
| 0.8673611111111111 | 0 |
| 0.8680555555555555 | 0 |
| 0.86875 | 0 |
| 0.8694444444444445 | 0 |
| 0.8701388888888889 | 0 |
| 0.8708333333333332 | 0 |
| 0.8715277777777778 | 0 |
| 0.8722222222222222 | 0 |
| 0.8729166666666667 | 0 |
| 0.873611111111111 | 0 |
| 0.8743055555555556 | 0 |
| 0.875 | 0 |
| 0.8756944444444444 | 0 |
| 0.876388888888889 | 0 |
| 0.8770833333333333 | 0 |
| 0.8777777777777778 | 0 |
| 0.8784722222222222 | 0 |
| 0.8791666666666668 | 0 |
| 0.8798611111111111 | 0 |
| 0.8805555555555555 | 0 |
| 0.88125 | 0 |
| 0.8819444444444445 | 0 |
| 0.8826388888888889 | 0 |
| 0.8833333333333333 | 0 |
| 0.8840277777777777 | 0 |
| 0.8847222222222223 | 0 |
| 0.8854166666666666 | 0 |
| 0.8861111111111111 | 0 |
| 0.8868055555555556 | 0 |
| 0.8875000000000001 | 0 |
| 0.8881944444444444 | 0 |
| 0.8888888888888888 | 0 |
| 0.8895833333333334 | 0 |
| 0.8902777777777778 | 0 |
| 0.8909722222222222 | 0 |
| 0.8916666666666666 | 0 |
| 0.8923611111111112 | 0 |
| 0.8930555555555556 | 0 |
| 0.8937499999999999 | 0 |
| 0.8944444444444444 | 0 |
| 0.8951388888888889 | 0 |
| 0.8958333333333334 | 0 |
| 0.8965277777777777 | 0 |
| 0.8972222222222223 | 0 |
| 0.8979166666666667 | 0 |
| 0.8986111111111111 | 0 |
| 0.8993055555555555 | 0 |
| 0.9 | 0 |
| 0.9006944444444445 | 0 |
| 0.9013888888888889 | 0 |
| 0.9020833333333332 | 0 |
| 0.9027777777777778 | 0 |
| 0.9034722222222222 | 0 |
| 0.9041666666666667 | 0 |
| 0.904861111111111 | 0 |
| 0.9055555555555556 | 0 |
| 0.90625 | 0 |
| 0.9069444444444444 | 0 |
| 0.907638888888889 | 0 |
| 0.9083333333333333 | 0 |
| 0.9090277777777778 | 0 |
| 0.9097222222222222 | 0 |
| 0.9104166666666668 | 0 |
| 0.9111111111111111 | 0 |
| 0.9118055555555555 | 0 |
| 0.9125 | 0 |
| 0.9131944444444445 | 0 |
| 0.9138888888888889 | 0 |
| 0.9145833333333333 | 0 |
| 0.9152777777777777 | 0 |
| 0.9159722222222223 | 0 |
| 0.9166666666666666 | 0 |
| 0.9173611111111111 | 0 |
| 0.9180555555555556 | 0 |
| 0.9187500000000001 | 0 |
| 0.9194444444444444 | 0 |
| 0.9201388888888888 | 0 |
| 0.9208333333333334 | 0 |
| 0.9215277777777778 | 0 |
| 0.9222222222222222 | 0 |
| 0.9229166666666666 | 0 |
| 0.9236111111111112 | 0 |
| 0.9243055555555556 | 0 |
| 0.9249999999999999 | 0 |
| 0.9256944444444444 | 0 |
| 0.9263888888888889 | 0 |
| 0.9270833333333334 | 0 |
| 0.9277777777777777 | 0 |
| 0.9284722222222223 | 0 |
| 0.9291666666666667 | 0 |
| 0.9298611111111111 | 0 |
| 0.9305555555555555 | 0 |
| 0.93125 | 0 |
| 0.9319444444444445 | 0 |
| 0.9326388888888889 | 0 |
| 0.9333333333333332 | 0 |
| 0.9340277777777778 | 0 |
| 0.9347222222222222 | 0 |
| 0.9354166666666667 | 0 |
| 0.936111111111111 | 0 |
| 0.9368055555555556 | 0 |
| 0.9375 | 0 |
| 0.9381944444444444 | 0 |
| 0.938888888888889 | 0 |
| 0.9395833333333333 | 0 |
| 0.9402777777777778 | 0 |
| 0.9409722222222222 | 0 |
| 0.9416666666666668 | 0 |
| 0.9423611111111111 | 0 |
| 0.9430555555555555 | 0 |
| 0.94375 | 0 |
| 0.9444444444444445 | 0 |
| 0.9451388888888889 | 0 |
| 0.9458333333333333 | 0 |
| 0.9465277777777777 | 0 |
| 0.9472222222222223 | 0 |
| 0.9479166666666666 | 0 |
| 0.9486111111111111 | 0 |
| 0.9493055555555556 | 0 |
| 0.9500000000000001 | 0 |
| 0.9506944444444444 | 0 |
| 0.9513888888888888 | 0 |
| 0.9520833333333334 | 0 |
| 0.9527777777777778 | 0 |
| 0.9534722222222222 | 0 |
| 0.9541666666666666 | 0 |
| 0.9548611111111112 | 0 |
| 0.9555555555555556 | 0 |
| 0.9562499999999999 | 0 |
| 0.9569444444444444 | 0 |
| 0.9576388888888889 | 0 |
| 0.9583333333333334 | 0 |
| 0.9590277777777777 | 0 |
| 0.9597222222222223 | 0 |
| 0.9604166666666667 | 0 |
| 0.9611111111111111 | 0 |
| 0.9618055555555555 | 0 |
| 0.9625 | 0 |
| 0.9631944444444445 | 0 |
| 0.9638888888888889 | 0 |
| 0.9645833333333332 | 0 |
| 0.9652777777777778 | 0 |
| 0.9659722222222222 | 0 |
| 0.9666666666666667 | 0 |
| 0.967361111111111 | 0 |
| 0.9680555555555556 | 0 |
| 0.96875 | 0 |
| 0.9694444444444444 | 0 |
| 0.970138888888889 | 0 |
| 0.9708333333333333 | 0 |
| 0.9715277777777778 | 0 |
| 0.9722222222222222 | 0 |
| 0.9729166666666668 | 0 |
| 0.9736111111111111 | 0 |
| 0.9743055555555555 | 0 |
| 0.975 | 0 |
| 0.9756944444444445 | 0 |
| 0.9763888888888889 | 0 |
| 0.9770833333333333 | 0 |
| 0.9777777777777777 | 0 |
| 0.9784722222222223 | 0 |
| 0.9791666666666666 | 0 |
| 0.9798611111111111 | 0 |
| 0.9805555555555556 | 0 |
| 0.9812500000000001 | 0 |
| 0.9819444444444444 | 0 |
| 0.9826388888888888 | 0 |
| 0.9833333333333334 | 0 |
| 0.9840277777777778 | 0 |
| 0.9847222222222222 | 0 |
| 0.9854166666666666 | 0 |
| 0.9861111111111112 | 0 |
| 0.9868055555555556 | 0 |
| 0.9874999999999999 | 0 |
| 0.9881944444444444 | 0 |
| 0.9888888888888889 | 0 |
| 0.9895833333333334 | 0 |
| 0.9902777777777777 | 0 |
| 0.9909722222222223 | 0 |
| 0.9916666666666667 | 0 |
| 0.9923611111111111 | 0 |
| 0.9930555555555555 | 0 |
| 0.99375 | 0 |
| 0.9944444444444445 | 0 |
| 0.9951388888888889 | 0 |
| 0.9958333333333332 | 0 |
| 0.9965277777777778 | 0 |
| 0.9972222222222222 | 0 |
| 0.9979166666666667 | 0 |
| 0.998611111111111 | 0 |
| 0.9993055555555556 | 0 |